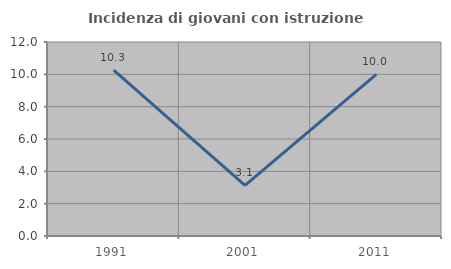
| Category | Incidenza di giovani con istruzione universitaria |
|---|---|
| 1991.0 | 10.256 |
| 2001.0 | 3.125 |
| 2011.0 | 10 |